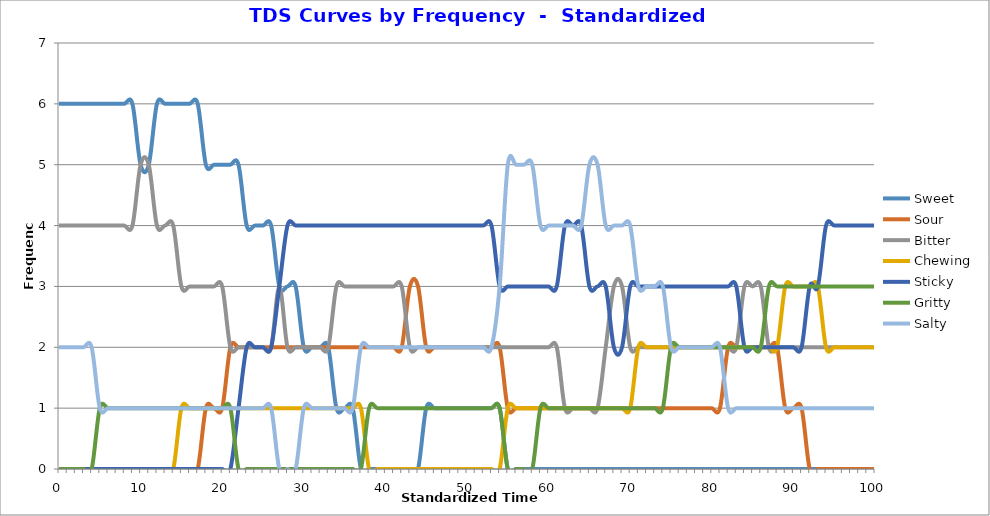
| Category | Sweet | Sour | Bitter | Chewing | Sticky | Gritty | Salty |
|---|---|---|---|---|---|---|---|
| 0.0 | 6 | 0 | 4 | 0 | 0 | 0 | 2 |
| 1.0 | 6 | 0 | 4 | 0 | 0 | 0 | 2 |
| 2.0 | 6 | 0 | 4 | 0 | 0 | 0 | 2 |
| 3.0 | 6 | 0 | 4 | 0 | 0 | 0 | 2 |
| 4.0 | 6 | 0 | 4 | 0 | 0 | 0 | 2 |
| 5.0 | 6 | 0 | 4 | 0 | 0 | 1 | 1 |
| 6.0 | 6 | 0 | 4 | 0 | 0 | 1 | 1 |
| 7.0 | 6 | 0 | 4 | 0 | 0 | 1 | 1 |
| 8.0 | 6 | 0 | 4 | 0 | 0 | 1 | 1 |
| 9.0 | 6 | 0 | 4 | 0 | 0 | 1 | 1 |
| 10.0 | 5 | 0 | 5 | 0 | 0 | 1 | 1 |
| 11.0 | 5 | 0 | 5 | 0 | 0 | 1 | 1 |
| 12.0 | 6 | 0 | 4 | 0 | 0 | 1 | 1 |
| 13.0 | 6 | 0 | 4 | 0 | 0 | 1 | 1 |
| 14.0 | 6 | 0 | 4 | 0 | 0 | 1 | 1 |
| 15.0 | 6 | 0 | 3 | 1 | 0 | 1 | 1 |
| 16.0 | 6 | 0 | 3 | 1 | 0 | 1 | 1 |
| 17.0 | 6 | 0 | 3 | 1 | 0 | 1 | 1 |
| 18.0 | 5 | 1 | 3 | 1 | 0 | 1 | 1 |
| 19.0 | 5 | 1 | 3 | 1 | 0 | 1 | 1 |
| 20.0 | 5 | 1 | 3 | 1 | 0 | 1 | 1 |
| 21.0 | 5 | 2 | 2 | 1 | 0 | 1 | 1 |
| 22.0 | 5 | 2 | 2 | 1 | 1 | 0 | 1 |
| 23.0 | 4 | 2 | 2 | 1 | 2 | 0 | 1 |
| 24.0 | 4 | 2 | 2 | 1 | 2 | 0 | 1 |
| 25.0 | 4 | 2 | 2 | 1 | 2 | 0 | 1 |
| 26.0 | 4 | 2 | 2 | 1 | 2 | 0 | 1 |
| 27.0 | 3 | 2 | 3 | 1 | 3 | 0 | 0 |
| 28.0 | 3 | 2 | 2 | 1 | 4 | 0 | 0 |
| 29.0 | 3 | 2 | 2 | 1 | 4 | 0 | 0 |
| 30.0 | 2 | 2 | 2 | 1 | 4 | 0 | 1 |
| 31.0 | 2 | 2 | 2 | 1 | 4 | 0 | 1 |
| 32.0 | 2 | 2 | 2 | 1 | 4 | 0 | 1 |
| 33.0 | 2 | 2 | 2 | 1 | 4 | 0 | 1 |
| 34.0 | 1 | 2 | 3 | 1 | 4 | 0 | 1 |
| 35.0 | 1 | 2 | 3 | 1 | 4 | 0 | 1 |
| 36.0 | 1 | 2 | 3 | 1 | 4 | 0 | 1 |
| 37.0 | 0 | 2 | 3 | 1 | 4 | 0 | 2 |
| 38.0 | 0 | 2 | 3 | 0 | 4 | 1 | 2 |
| 39.0 | 0 | 2 | 3 | 0 | 4 | 1 | 2 |
| 40.0 | 0 | 2 | 3 | 0 | 4 | 1 | 2 |
| 41.0 | 0 | 2 | 3 | 0 | 4 | 1 | 2 |
| 42.0 | 0 | 2 | 3 | 0 | 4 | 1 | 2 |
| 43.0 | 0 | 3 | 2 | 0 | 4 | 1 | 2 |
| 44.0 | 0 | 3 | 2 | 0 | 4 | 1 | 2 |
| 45.0 | 1 | 2 | 2 | 0 | 4 | 1 | 2 |
| 46.0 | 1 | 2 | 2 | 0 | 4 | 1 | 2 |
| 47.0 | 1 | 2 | 2 | 0 | 4 | 1 | 2 |
| 48.0 | 1 | 2 | 2 | 0 | 4 | 1 | 2 |
| 49.0 | 1 | 2 | 2 | 0 | 4 | 1 | 2 |
| 50.0 | 1 | 2 | 2 | 0 | 4 | 1 | 2 |
| 51.0 | 1 | 2 | 2 | 0 | 4 | 1 | 2 |
| 52.0 | 1 | 2 | 2 | 0 | 4 | 1 | 2 |
| 53.0 | 1 | 2 | 2 | 0 | 4 | 1 | 2 |
| 54.0 | 1 | 2 | 2 | 0 | 3 | 1 | 3 |
| 55.0 | 0 | 1 | 2 | 1 | 3 | 0 | 5 |
| 56.0 | 0 | 1 | 2 | 1 | 3 | 0 | 5 |
| 57.0 | 0 | 1 | 2 | 1 | 3 | 0 | 5 |
| 58.0 | 0 | 1 | 2 | 1 | 3 | 0 | 5 |
| 59.0 | 0 | 1 | 2 | 1 | 3 | 1 | 4 |
| 60.0 | 0 | 1 | 2 | 1 | 3 | 1 | 4 |
| 61.0 | 0 | 1 | 2 | 1 | 3 | 1 | 4 |
| 62.0 | 0 | 1 | 1 | 1 | 4 | 1 | 4 |
| 63.0 | 0 | 1 | 1 | 1 | 4 | 1 | 4 |
| 64.0 | 0 | 1 | 1 | 1 | 4 | 1 | 4 |
| 65.0 | 0 | 1 | 1 | 1 | 3 | 1 | 5 |
| 66.0 | 0 | 1 | 1 | 1 | 3 | 1 | 5 |
| 67.0 | 0 | 1 | 2 | 1 | 3 | 1 | 4 |
| 68.0 | 0 | 1 | 3 | 1 | 2 | 1 | 4 |
| 69.0 | 0 | 1 | 3 | 1 | 2 | 1 | 4 |
| 70.0 | 0 | 1 | 2 | 1 | 3 | 1 | 4 |
| 71.0 | 0 | 1 | 2 | 2 | 3 | 1 | 3 |
| 72.0 | 0 | 1 | 2 | 2 | 3 | 1 | 3 |
| 73.0 | 0 | 1 | 2 | 2 | 3 | 1 | 3 |
| 74.0 | 0 | 1 | 2 | 2 | 3 | 1 | 3 |
| 75.0 | 0 | 1 | 2 | 2 | 3 | 2 | 2 |
| 76.0 | 0 | 1 | 2 | 2 | 3 | 2 | 2 |
| 77.0 | 0 | 1 | 2 | 2 | 3 | 2 | 2 |
| 78.0 | 0 | 1 | 2 | 2 | 3 | 2 | 2 |
| 79.0 | 0 | 1 | 2 | 2 | 3 | 2 | 2 |
| 80.0 | 0 | 1 | 2 | 2 | 3 | 2 | 2 |
| 81.0 | 0 | 1 | 2 | 2 | 3 | 2 | 2 |
| 82.0 | 0 | 2 | 2 | 2 | 3 | 2 | 1 |
| 83.0 | 0 | 2 | 2 | 2 | 3 | 2 | 1 |
| 84.0 | 0 | 2 | 3 | 2 | 2 | 2 | 1 |
| 85.0 | 0 | 2 | 3 | 2 | 2 | 2 | 1 |
| 86.0 | 0 | 2 | 3 | 2 | 2 | 2 | 1 |
| 87.0 | 0 | 2 | 2 | 2 | 2 | 3 | 1 |
| 88.0 | 0 | 2 | 2 | 2 | 2 | 3 | 1 |
| 89.0 | 0 | 1 | 2 | 3 | 2 | 3 | 1 |
| 90.0 | 0 | 1 | 2 | 3 | 2 | 3 | 1 |
| 91.0 | 0 | 1 | 2 | 3 | 2 | 3 | 1 |
| 92.0 | 0 | 0 | 2 | 3 | 3 | 3 | 1 |
| 93.0 | 0 | 0 | 2 | 3 | 3 | 3 | 1 |
| 94.0 | 0 | 0 | 2 | 2 | 4 | 3 | 1 |
| 95.0 | 0 | 0 | 2 | 2 | 4 | 3 | 1 |
| 96.0 | 0 | 0 | 2 | 2 | 4 | 3 | 1 |
| 97.0 | 0 | 0 | 2 | 2 | 4 | 3 | 1 |
| 98.0 | 0 | 0 | 2 | 2 | 4 | 3 | 1 |
| 99.0 | 0 | 0 | 2 | 2 | 4 | 3 | 1 |
| 100.0 | 0 | 0 | 2 | 2 | 4 | 3 | 1 |